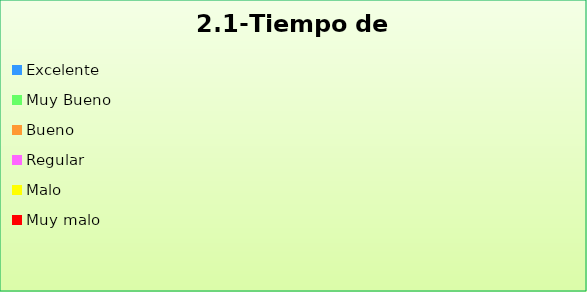
| Category | Series 0 |
|---|---|
| Excelente | 0.247 |
| Muy Bueno | 0.411 |
| Bueno  | 0.244 |
| Regular  | 0.095 |
| Malo  | 0.003 |
| Muy malo  | 0 |